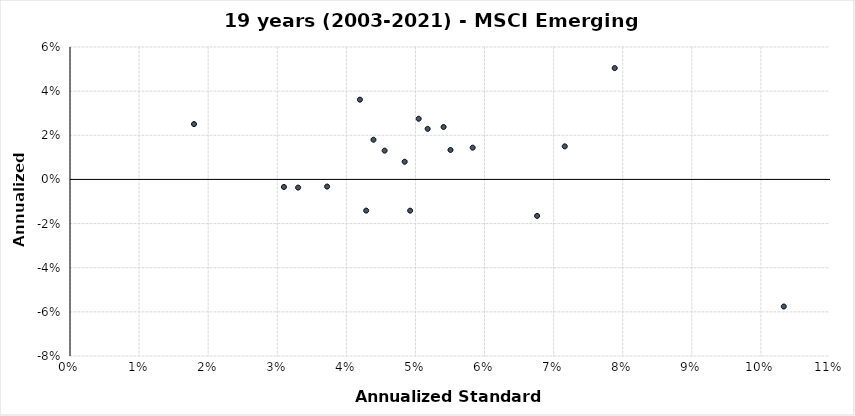
| Category | Series 0 |
|---|---|
| 0.04196545973583698 | 0.036 |
| 0.04392423945437382 | 0.018 |
| 0.05407400411925498 | 0.024 |
| 0.05176819145692645 | 0.023 |
| 0.050466748466305236 | 0.028 |
| 0.10331244578670071 | -0.058 |
| 0.07884156249245527 | 0.05 |
| 0.058283694374872234 | 0.014 |
| 0.0676056281326162 | -0.017 |
| 0.055069079518146456 | 0.013 |
| 0.03301648968867618 | -0.004 |
| 0.037213943394073384 | -0.003 |
| 0.049231713268807056 | -0.014 |
| 0.04843971354906968 | 0.008 |
| 0.01794871612604143 | 0.025 |
| 0.04286858727947442 | -0.014 |
| 0.04553858416475209 | 0.013 |
| 0.07161222169471956 | 0.015 |
| 0.030964557816139073 | -0.003 |